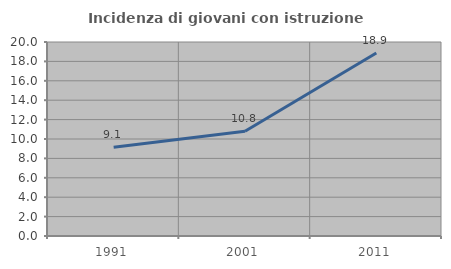
| Category | Incidenza di giovani con istruzione universitaria |
|---|---|
| 1991.0 | 9.146 |
| 2001.0 | 10.791 |
| 2011.0 | 18.868 |